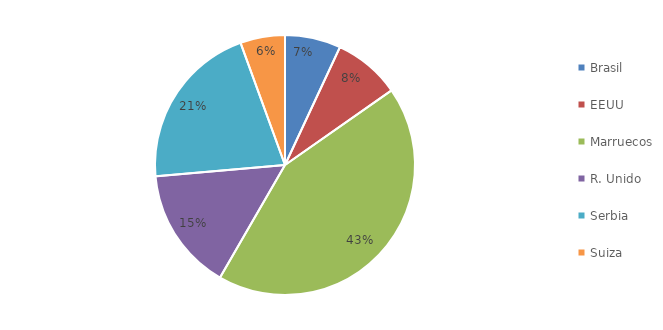
| Category | Series 0 |
|---|---|
| Brasil | 5 |
| EEUU | 6 |
| Marruecos | 31 |
| R. Unido | 11 |
| Serbia | 15 |
| Suiza | 4 |